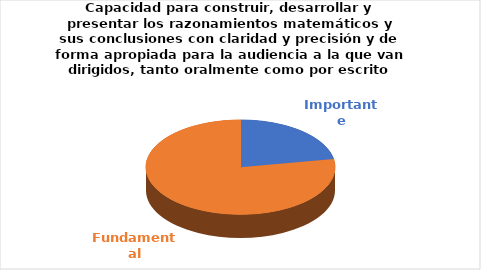
| Category | Series 0 |
|---|---|
| Importante | 4 |
| Fundamental | 14 |